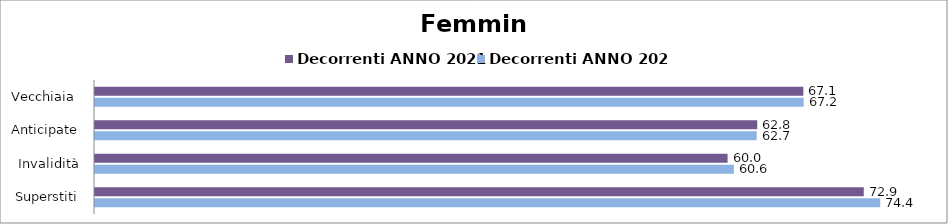
| Category | Decorrenti ANNO 2021 | Decorrenti ANNO 2022 |
|---|---|---|
| Vecchiaia  | 67.14 | 67.17 |
| Anticipate | 62.77 | 62.72 |
| Invalidità | 59.96 | 60.56 |
| Superstiti | 72.87 | 74.43 |